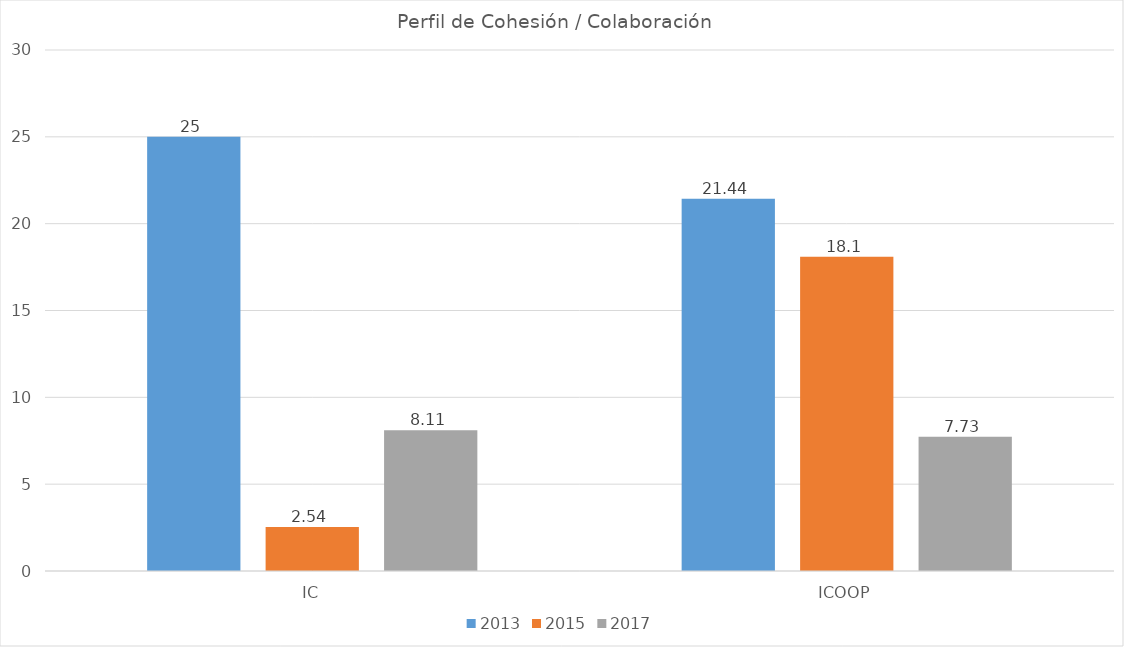
| Category | 2013 | 2015 | 2017 |
|---|---|---|---|
| IC | 25 | 2.54 | 8.11 |
| ICOOP | 21.44 | 18.1 | 7.73 |